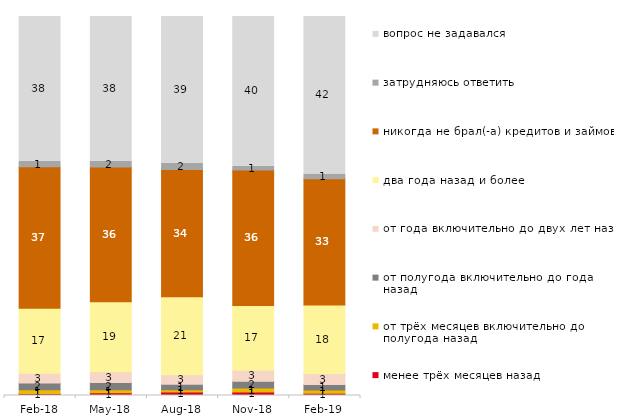
| Category | менее трёх месяцев назад | от трёх месяцев включительно до полугода назад | от полугода включительно до года назад | от года включительно до двух лет назад | два года назад и более | никогда не брал(-а) кредитов и займов | затрудняюсь ответить | вопрос не задавался |
|---|---|---|---|---|---|---|---|---|
| 2018-02-01 | 0.55 | 1 | 1.75 | 2.6 | 17.1 | 37.35 | 1.45 | 38.2 |
| 2018-05-01 | 0.75 | 0.8 | 1.9 | 2.8 | 18.5 | 35.55 | 1.5 | 38.2 |
| 2018-08-01 | 0.9 | 0.6 | 1.45 | 2.55 | 20.55 | 33.55 | 1.7 | 38.7 |
| 2018-11-01 | 0.948 | 0.998 | 1.846 | 2.844 | 17.116 | 35.778 | 0.948 | 39.521 |
| 2019-02-01 | 0.6 | 0.85 | 1.45 | 2.9 | 18.1 | 33.3 | 1.25 | 41.55 |